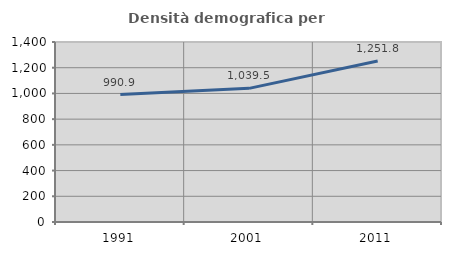
| Category | Densità demografica |
|---|---|
| 1991.0 | 990.904 |
| 2001.0 | 1039.452 |
| 2011.0 | 1251.789 |